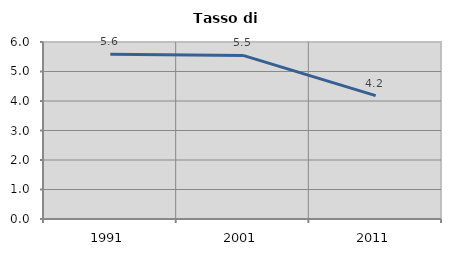
| Category | Tasso di disoccupazione   |
|---|---|
| 1991.0 | 5.585 |
| 2001.0 | 5.546 |
| 2011.0 | 4.18 |